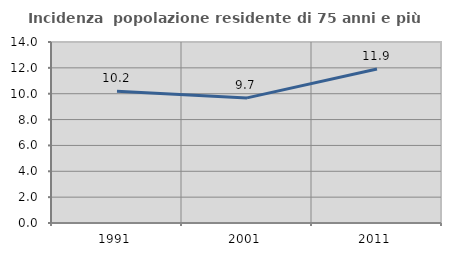
| Category | Incidenza  popolazione residente di 75 anni e più |
|---|---|
| 1991.0 | 10.186 |
| 2001.0 | 9.677 |
| 2011.0 | 11.91 |